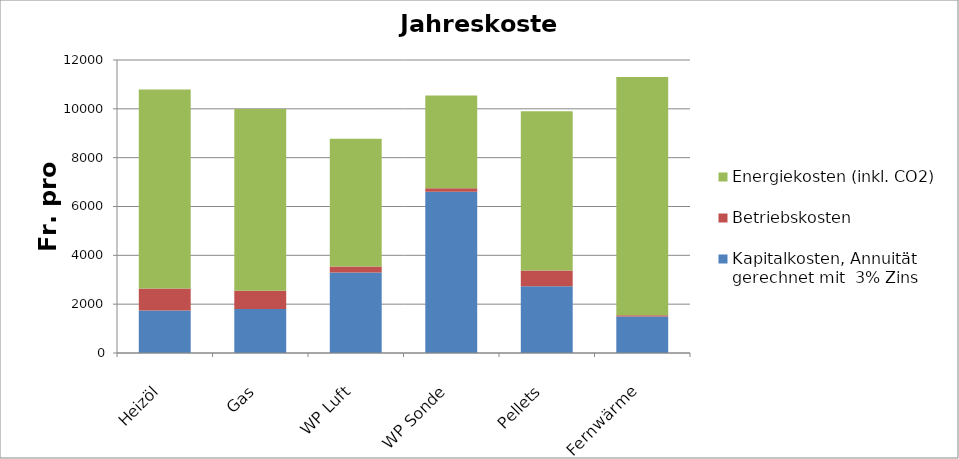
| Category | Kapitalkosten, Annuität gerechnet mit  3% Zins | Betriebskosten | Energiekosten (inkl. CO2) |
|---|---|---|---|
| Heizöl | 1744.68 | 900 | 8150 |
| Gas | 1800.96 | 750 | 7440 |
| WP Luft | 3292.38 | 250 | 5232.308 |
| WP Sonde | 6601.644 | 150 | 3790 |
| Pellets | 2729.58 | 650 | 6520 |
| Fernwärme | 1491.42 | 50 | 9760 |